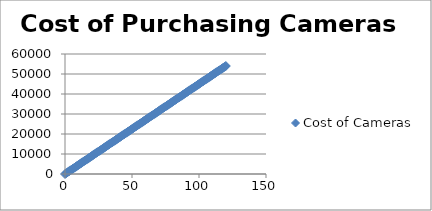
| Category | Cost of Cameras |
|---|---|
| 0.0 | 0 |
| 1.0 | 450 |
| 2.0 | 900 |
| 3.0 | 1350 |
| 4.0 | 1800 |
| 5.0 | 2250 |
| 6.0 | 2700 |
| 7.0 | 3150 |
| 8.0 | 3600 |
| 9.0 | 4050 |
| 10.0 | 4500 |
| 11.0 | 4950 |
| 12.0 | 5400 |
| 13.0 | 5850 |
| 14.0 | 6300 |
| 15.0 | 6750 |
| 16.0 | 7200 |
| 17.0 | 7650 |
| 18.0 | 8100 |
| 19.0 | 8550 |
| 20.0 | 9000 |
| 21.0 | 9450 |
| 22.0 | 9900 |
| 23.0 | 10350 |
| 24.0 | 10800 |
| 25.0 | 11250 |
| 26.0 | 11700 |
| 27.0 | 12150 |
| 28.0 | 12600 |
| 29.0 | 13050 |
| 30.0 | 13500 |
| 31.0 | 13950 |
| 32.0 | 14400 |
| 33.0 | 14850 |
| 34.0 | 15300 |
| 35.0 | 15750 |
| 36.0 | 16200 |
| 37.0 | 16650 |
| 38.0 | 17100 |
| 39.0 | 17550 |
| 40.0 | 18000 |
| 41.0 | 18450 |
| 42.0 | 18900 |
| 43.0 | 19350 |
| 44.0 | 19800 |
| 45.0 | 20250 |
| 46.0 | 20700 |
| 47.0 | 21150 |
| 48.0 | 21600 |
| 49.0 | 22050 |
| 50.0 | 22500 |
| 51.0 | 22950 |
| 52.0 | 23400 |
| 53.0 | 23850 |
| 54.0 | 24300 |
| 55.0 | 24750 |
| 56.0 | 25200 |
| 57.0 | 25650 |
| 58.0 | 26100 |
| 59.0 | 26550 |
| 60.0 | 27000 |
| 61.0 | 27450 |
| 62.0 | 27900 |
| 63.0 | 28350 |
| 64.0 | 28800 |
| 65.0 | 29250 |
| 66.0 | 29700 |
| 67.0 | 30150 |
| 68.0 | 30600 |
| 69.0 | 31050 |
| 70.0 | 31500 |
| 71.0 | 31950 |
| 72.0 | 32400 |
| 73.0 | 32850 |
| 74.0 | 33300 |
| 75.0 | 33750 |
| 76.0 | 34200 |
| 77.0 | 34650 |
| 78.0 | 35100 |
| 79.0 | 35550 |
| 80.0 | 36000 |
| 81.0 | 36450 |
| 82.0 | 36900 |
| 83.0 | 37350 |
| 84.0 | 37800 |
| 85.0 | 38250 |
| 86.0 | 38700 |
| 87.0 | 39150 |
| 88.0 | 39600 |
| 89.0 | 40050 |
| 90.0 | 40500 |
| 91.0 | 40950 |
| 92.0 | 41400 |
| 93.0 | 41850 |
| 94.0 | 42300 |
| 95.0 | 42750 |
| 96.0 | 43200 |
| 97.0 | 43650 |
| 98.0 | 44100 |
| 99.0 | 44550 |
| 100.0 | 45000 |
| 101.0 | 45450 |
| 102.0 | 45900 |
| 103.0 | 46350 |
| 104.0 | 46800 |
| 105.0 | 47250 |
| 106.0 | 47700 |
| 107.0 | 48150 |
| 108.0 | 48600 |
| 109.0 | 49050 |
| 110.0 | 49500 |
| 111.0 | 49950 |
| 112.0 | 50400 |
| 113.0 | 50850 |
| 114.0 | 51300 |
| 115.0 | 51750 |
| 116.0 | 52200 |
| 117.0 | 52650 |
| 118.0 | 53100 |
| 119.0 | 53550 |
| 120.0 | 54000 |